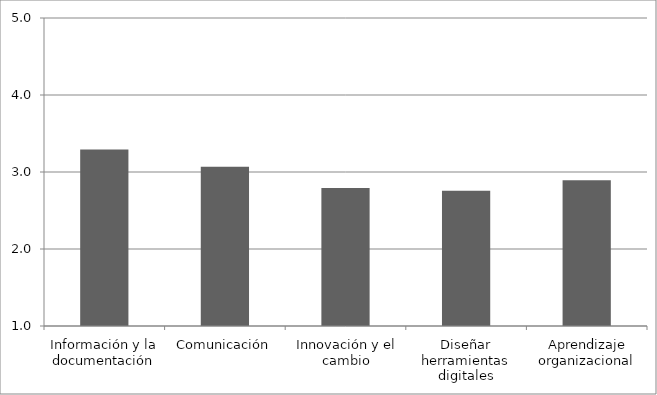
| Category | Series 0 |
|---|---|
| Información y la documentación | 3.292 |
| Comunicación | 3.07 |
| Innovación y el cambio | 2.791 |
| Diseñar herramientas digitales | 2.756 |
| Aprendizaje organizacional | 2.891 |